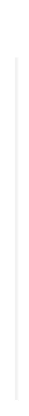
| Category | Series 0 |
|---|---|
| 0 | 90.5 |